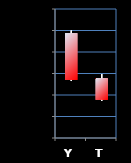
| Category | Series 0 | Series 1 | Series 2 | Series 3 |
|---|---|---|---|---|
| Y | 1528.75 | 1530 | 1506.5 | 1507 |
| T | 1507.75 | 1509.75 | 1497.25 | 1497.75 |